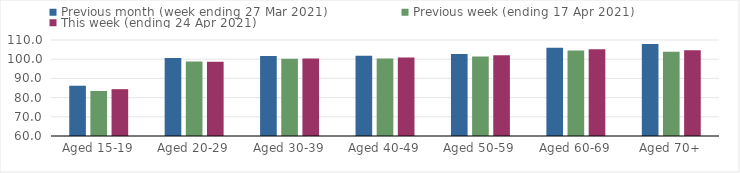
| Category | Previous month (week ending 27 Mar 2021) | Previous week (ending 17 Apr 2021) | This week (ending 24 Apr 2021) |
|---|---|---|---|
| Aged 15-19 | 86.18 | 83.44 | 84.39 |
| Aged 20-29 | 100.56 | 98.76 | 98.72 |
| Aged 30-39 | 101.73 | 100.18 | 100.38 |
| Aged 40-49 | 101.76 | 100.31 | 100.84 |
| Aged 50-59 | 102.68 | 101.37 | 102.01 |
| Aged 60-69 | 105.97 | 104.49 | 105.16 |
| Aged 70+ | 107.94 | 103.86 | 104.65 |